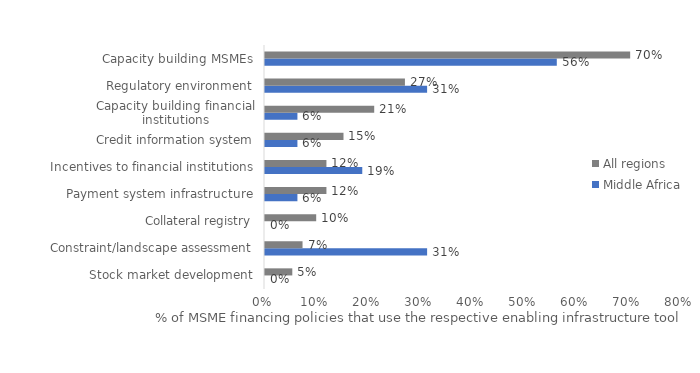
| Category | Middle Africa | All regions |
|---|---|---|
| Stock market development | 0 | 0.053 |
| Constraint/landscape assessment | 0.312 | 0.072 |
| Collateral registry | 0 | 0.099 |
| Payment system infrastructure | 0.062 | 0.118 |
| Incentives to financial institutions | 0.188 | 0.118 |
| Credit information system | 0.062 | 0.151 |
| Capacity building financial institutions | 0.062 | 0.211 |
| Regulatory environment | 0.312 | 0.27 |
| Capacity building MSMEs | 0.562 | 0.704 |